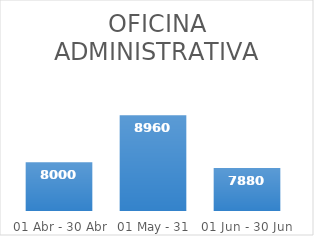
| Category | Series 0 |
|---|---|
| 01 Abr - 30 Abr | 8000 |
| 01 May - 31 May | 8960 |
| 01 Jun - 30 Jun | 7880 |